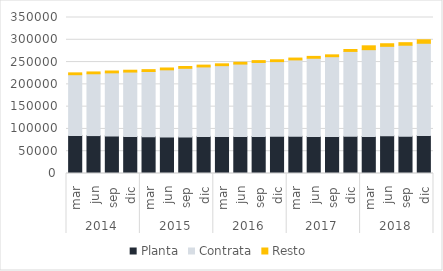
| Category | Planta | Contrata | Resto |
|---|---|---|---|
| 0 | 85251 | 136401 | 4151 |
| 1 | 85069 | 138672 | 4128 |
| 2 | 84258 | 141563 | 4144 |
| 3 | 83159 | 144449 | 4109 |
| 4 | 82683 | 146156 | 4155 |
| 5 | 81627 | 150979 | 4130 |
| 6 | 82072 | 153976 | 4066 |
| 7 | 83270 | 155827 | 4075 |
| 8 | 82950 | 159026 | 4109 |
| 9 | 83141 | 162360 | 4094 |
| 10 | 82936 | 166174 | 4149 |
| 11 | 83309 | 167698 | 4148 |
| 12 | 83387 | 171479 | 4140 |
| 13 | 83189 | 175409 | 4155 |
| 14 | 83157 | 178911 | 4155 |
| 15 | 83304 | 190625 | 4325 |
| 16 | 83239 | 194581 | 8661 |
| 17 | 84757 | 200589 | 5786 |
| 18 | 83639 | 204141 | 5751 |
| 19 | 85101 | 207090 | 7801 |